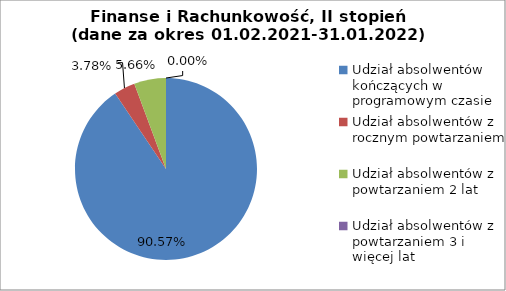
| Category | Series 0 |
|---|---|
| Udział absolwentów kończących w programowym czasie | 90.566 |
| Udział absolwentów z rocznym powtarzaniem | 3.774 |
| Udział absolwentów z powtarzaniem 2 lat | 5.66 |
| Udział absolwentów z powtarzaniem 3 i więcej lat | 0 |